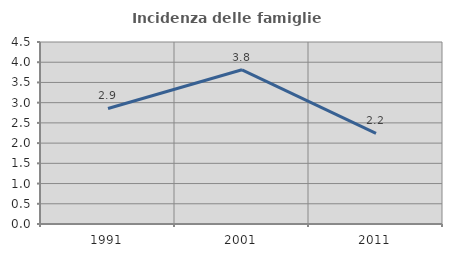
| Category | Incidenza delle famiglie numerose |
|---|---|
| 1991.0 | 2.857 |
| 2001.0 | 3.812 |
| 2011.0 | 2.239 |